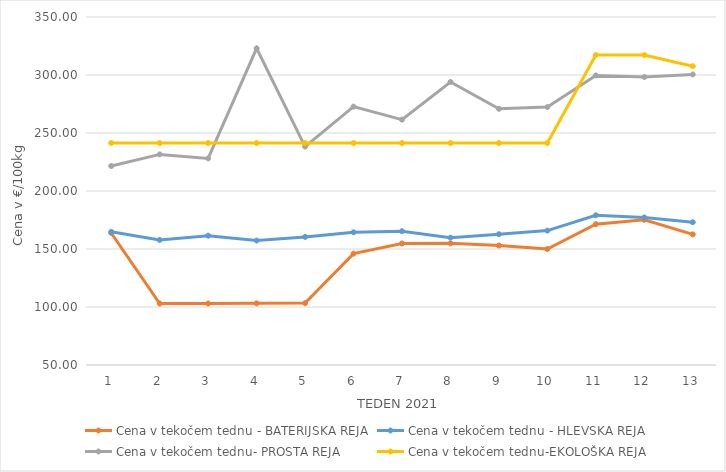
| Category | Cena v tekočem tednu - BATERIJSKA REJA | Cena v tekočem tednu - HLEVSKA REJA | Cena v tekočem tednu- PROSTA REJA | Cena v tekočem tednu-EKOLOŠKA REJA |
|---|---|---|---|---|
| 1.0 | 163.81 | 164.86 | 221.55 | 241.38 |
| 2.0 | 103.02 | 157.81 | 231.55 | 241.38 |
| 3.0 | 103.03 | 161.48 | 228.1 | 241.38 |
| 4.0 | 103.15 | 157.29 | 322.93 | 241.38 |
| 5.0 | 103.34 | 160.43 | 238.28 | 241.38 |
| 6.0 | 146.03 | 164.39 | 272.76 | 241.38 |
| 7.0 | 154.77 | 165.34 | 261.55 | 241.38 |
| 8.0 | 154.86 | 159.79 | 293.97 | 241.38 |
| 9.0 | 153 | 162.73 | 270.86 | 241.38 |
| 10.0 | 149.98 | 165.85 | 272.41 | 241.38 |
| 11.0 | 171.4 | 179.09 | 299.66 | 317.24 |
| 12.0 | 175.2 | 177.21 | 298.27 | 317.24 |
| 13.0 | 162.57 | 173.07 | 300.45 | 307.59 |